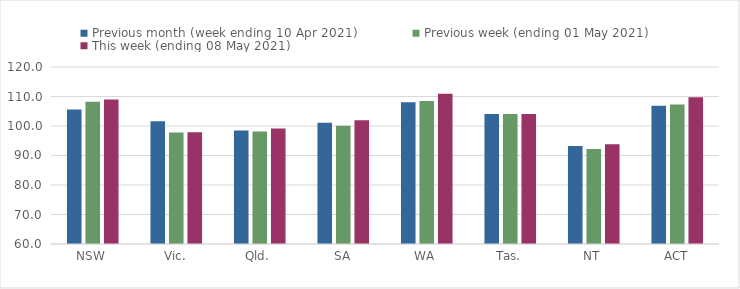
| Category | Previous month (week ending 10 Apr 2021) | Previous week (ending 01 May 2021) | This week (ending 08 May 2021) |
|---|---|---|---|
| NSW | 105.59 | 108.22 | 108.99 |
| Vic. | 101.58 | 97.79 | 97.89 |
| Qld. | 98.47 | 98.14 | 99.17 |
| SA | 101.14 | 100.05 | 101.95 |
| WA | 108.03 | 108.44 | 110.94 |
| Tas. | 104.1 | 104.1 | 104.1 |
| NT | 93.22 | 92.21 | 93.8 |
| ACT | 106.88 | 107.25 | 109.76 |